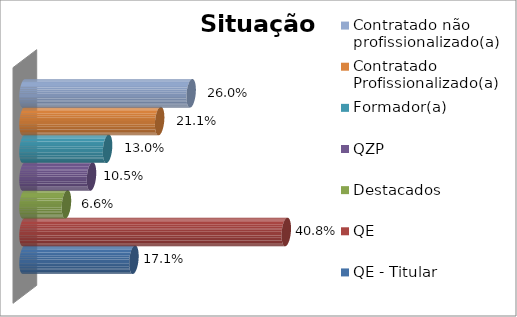
| Category | QE - Titular | QE | Destacados | QZP | Formador(a) | Contratado Profissionalizado(a) | Contratado não profissionalizado(a) |
|---|---|---|---|---|---|---|---|
| 0 | 0.171 | 0.408 | 0.066 | 0.105 | 0.13 | 0.211 | 0.26 |